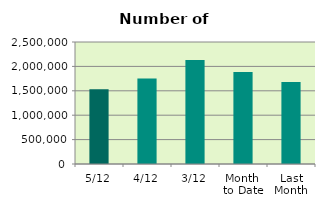
| Category | Series 0 |
|---|---|
| 5/12 | 1532888 |
| 4/12 | 1750798 |
| 3/12 | 2132994 |
| Month 
to Date | 1882911 |
| Last
Month | 1681386.857 |